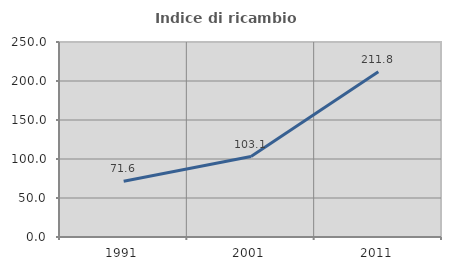
| Category | Indice di ricambio occupazionale  |
|---|---|
| 1991.0 | 71.591 |
| 2001.0 | 103.087 |
| 2011.0 | 211.789 |